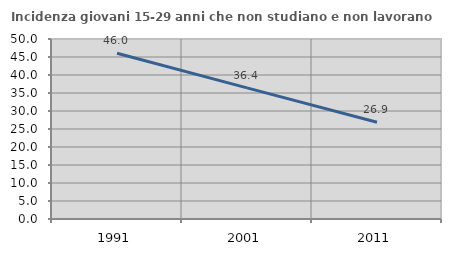
| Category | Incidenza giovani 15-29 anni che non studiano e non lavorano  |
|---|---|
| 1991.0 | 46.042 |
| 2001.0 | 36.424 |
| 2011.0 | 26.882 |